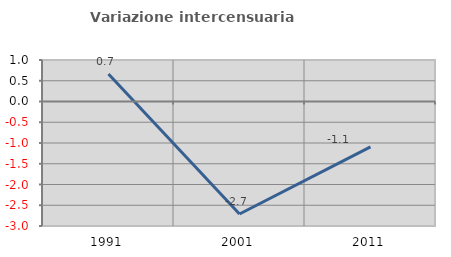
| Category | Variazione intercensuaria annua |
|---|---|
| 1991.0 | 0.662 |
| 2001.0 | -2.711 |
| 2011.0 | -1.094 |